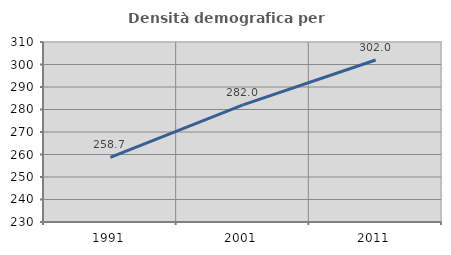
| Category | Densità demografica |
|---|---|
| 1991.0 | 258.681 |
| 2001.0 | 282.03 |
| 2011.0 | 301.98 |